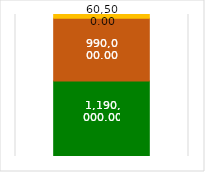
| Category | Series 2 | Series 1 | Series 0 | Series 3 |
|---|---|---|---|---|
| 0 |  | 1190000 | 990000 | 60500 |